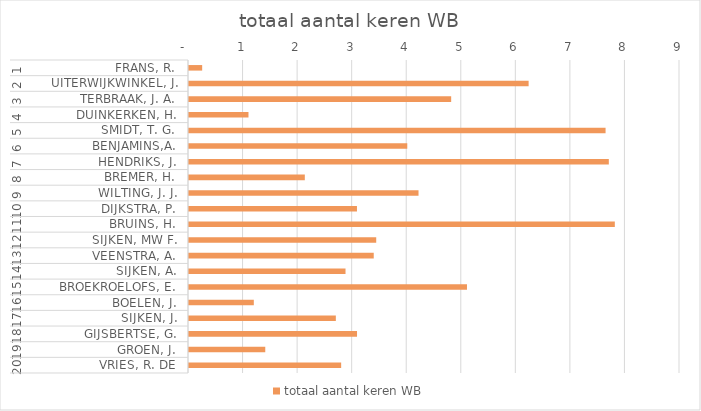
| Category | totaal aantal keren WB |
|---|---|
| 0 | 0.241 |
| 1 | 6.225 |
| 2 | 4.806 |
| 3 | 1.09 |
| 4 | 7.636 |
| 5 | 4.001 |
| 6 | 7.695 |
| 7 | 2.123 |
| 8 | 4.207 |
| 9 | 3.079 |
| 10 | 7.805 |
| 11 | 3.432 |
| 12 | 3.386 |
| 13 | 2.869 |
| 14 | 5.095 |
| 15 | 1.188 |
| 16 | 2.692 |
| 17 | 3.08 |
| 18 | 1.398 |
| 19 | 2.789 |